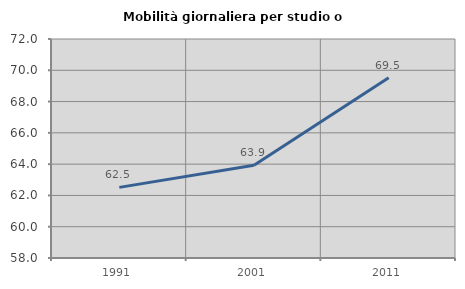
| Category | Mobilità giornaliera per studio o lavoro |
|---|---|
| 1991.0 | 62.516 |
| 2001.0 | 63.923 |
| 2011.0 | 69.53 |